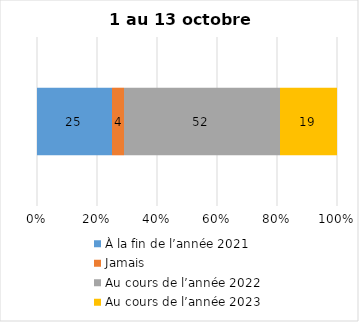
| Category | À la fin de l’année 2021 | Jamais | Au cours de l’année 2022 | Au cours de l’année 2023 |
|---|---|---|---|---|
| 0 | 25 | 4 | 52 | 19 |